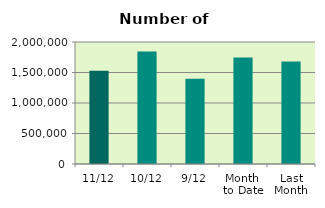
| Category | Series 0 |
|---|---|
| 11/12 | 1528952 |
| 10/12 | 1842806 |
| 9/12 | 1397358 |
| Month 
to Date | 1745344.5 |
| Last
Month | 1681386.857 |